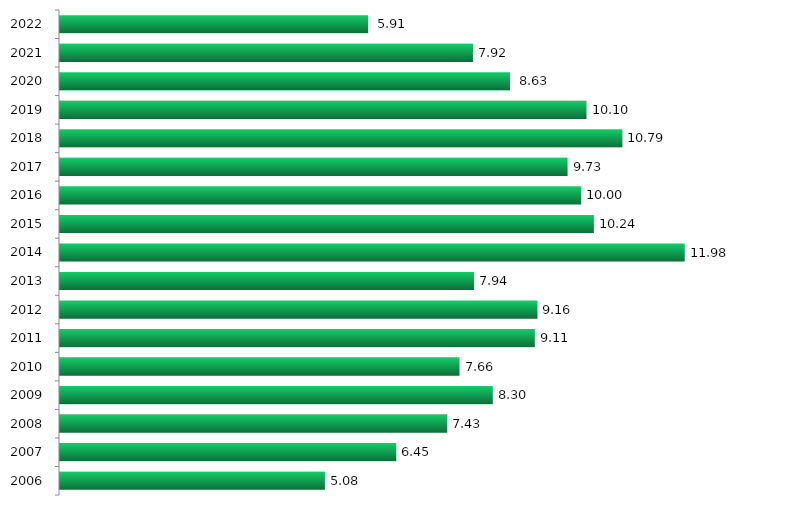
| Category | Series 0 |
|---|---|
| 2006.0 | 5.08 |
| 2007.0 | 6.449 |
| 2008.0 | 7.427 |
| 2009.0 | 8.301 |
| 2010.0 | 7.662 |
| 2011.0 | 9.106 |
| 2012.0 | 9.157 |
| 2013.0 | 7.941 |
| 2014.0 | 11.981 |
| 2015.0 | 10.24 |
| 2016.0 | 9.996 |
| 2017.0 | 9.734 |
| 2018.0 | 10.786 |
| 2019.0 | 10.098 |
| 2020.0 | 8.63 |
| 2021.0 | 7.92 |
| 2022.0 | 5.91 |